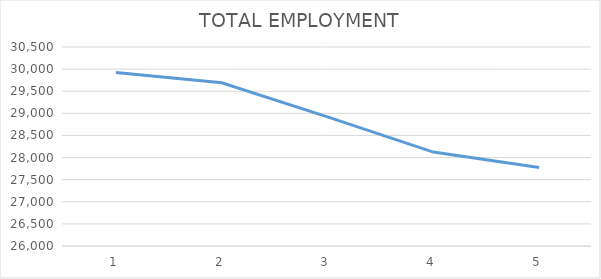
| Category | Series 0 |
|---|---|
| 0 | 29921 |
| 1 | 29691 |
| 2 | 28920 |
| 3 | 28124 |
| 4 | 27777 |